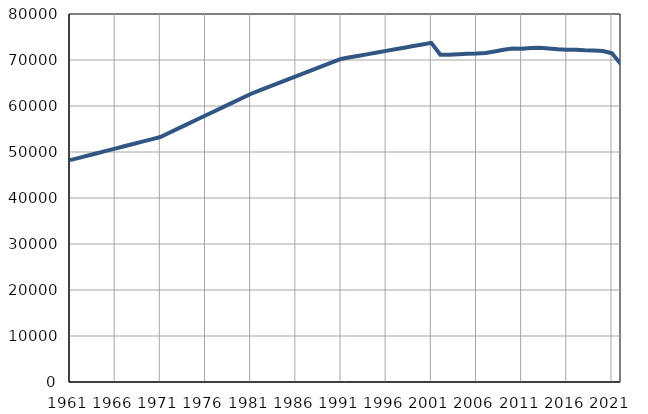
| Category | Population
size |
|---|---|
| 1961.0 | 48228 |
| 1962.0 | 48731 |
| 1963.0 | 49234 |
| 1964.0 | 49738 |
| 1965.0 | 50241 |
| 1966.0 | 50744 |
| 1967.0 | 51247 |
| 1968.0 | 51750 |
| 1969.0 | 52254 |
| 1970.0 | 52757 |
| 1971.0 | 53260 |
| 1972.0 | 54195 |
| 1973.0 | 55130 |
| 1974.0 | 56066 |
| 1975.0 | 57001 |
| 1976.0 | 57936 |
| 1977.0 | 58871 |
| 1978.0 | 59806 |
| 1979.0 | 60742 |
| 1980.0 | 61677 |
| 1981.0 | 62612 |
| 1982.0 | 63374 |
| 1983.0 | 64136 |
| 1984.0 | 64899 |
| 1985.0 | 65661 |
| 1986.0 | 66422 |
| 1987.0 | 67185 |
| 1988.0 | 67947 |
| 1989.0 | 68710 |
| 1990.0 | 69472 |
| 1991.0 | 70234 |
| 1992.0 | 70585 |
| 1993.0 | 70934 |
| 1994.0 | 71283 |
| 1995.0 | 71633 |
| 1996.0 | 71983 |
| 1997.0 | 72333 |
| 1998.0 | 72683 |
| 1999.0 | 73033 |
| 2000.0 | 73382 |
| 2001.0 | 73732 |
| 2002.0 | 71135 |
| 2003.0 | 71158 |
| 2004.0 | 71236 |
| 2005.0 | 71340 |
| 2006.0 | 71388 |
| 2007.0 | 71521 |
| 2008.0 | 71862 |
| 2009.0 | 72218 |
| 2010.0 | 72493 |
| 2011.0 | 72459 |
| 2012.0 | 72621 |
| 2013.0 | 72682 |
| 2014.0 | 72522 |
| 2015.0 | 72323 |
| 2016.0 | 72246 |
| 2017.0 | 72209 |
| 2018.0 | 72124 |
| 2019.0 | 72085 |
| 2020.0 | 71953 |
| 2021.0 | 71460 |
| 2022.0 | 69079 |